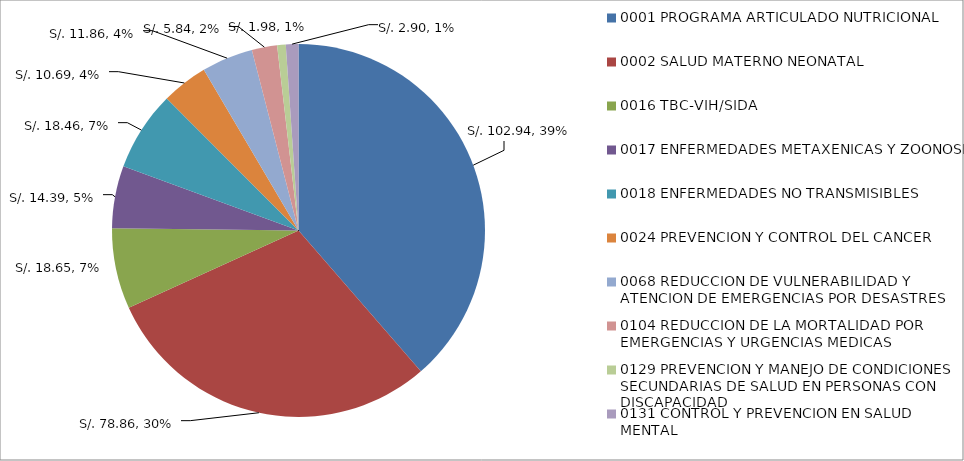
| Category | Series 0 |
|---|---|
| 0001 PROGRAMA ARTICULADO NUTRICIONAL | 102.941 |
| 0002 SALUD MATERNO NEONATAL | 78.855 |
| 0016 TBC-VIH/SIDA | 18.646 |
| 0017 ENFERMEDADES METAXENICAS Y ZOONOSIS | 14.392 |
| 0018 ENFERMEDADES NO TRANSMISIBLES | 18.462 |
| 0024 PREVENCION Y CONTROL DEL CANCER | 10.693 |
| 0068 REDUCCION DE VULNERABILIDAD Y ATENCION DE EMERGENCIAS POR DESASTRES | 11.861 |
| 0104 REDUCCION DE LA MORTALIDAD POR EMERGENCIAS Y URGENCIAS MEDICAS | 5.841 |
| 0129 PREVENCION Y MANEJO DE CONDICIONES SECUNDARIAS DE SALUD EN PERSONAS CON DISCAPACIDAD | 1.983 |
| 0131 CONTROL Y PREVENCION EN SALUD MENTAL | 2.904 |